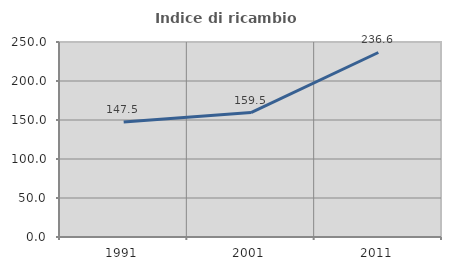
| Category | Indice di ricambio occupazionale  |
|---|---|
| 1991.0 | 147.541 |
| 2001.0 | 159.483 |
| 2011.0 | 236.559 |